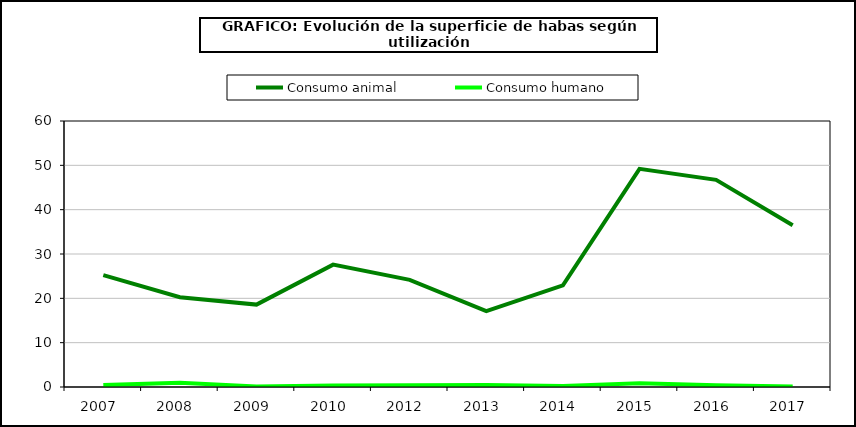
| Category | Consumo animal | Consumo humano |
|---|---|---|
| 2007  | 25.237 | 0.435 |
| 2008  | 20.238 | 0.969 |
| 2009  | 18.586 | 0.118 |
| 2010  | 27.596 | 0.361 |
| 2012  | 24.156 | 0.408 |
| 2013  | 17.1 | 0.442 |
| 2014  | 22.918 | 0.247 |
| 2015  | 49.204 | 0.868 |
| 2016  | 46.723 | 0.386 |
| 2017  | 36.47 | 0.104 |